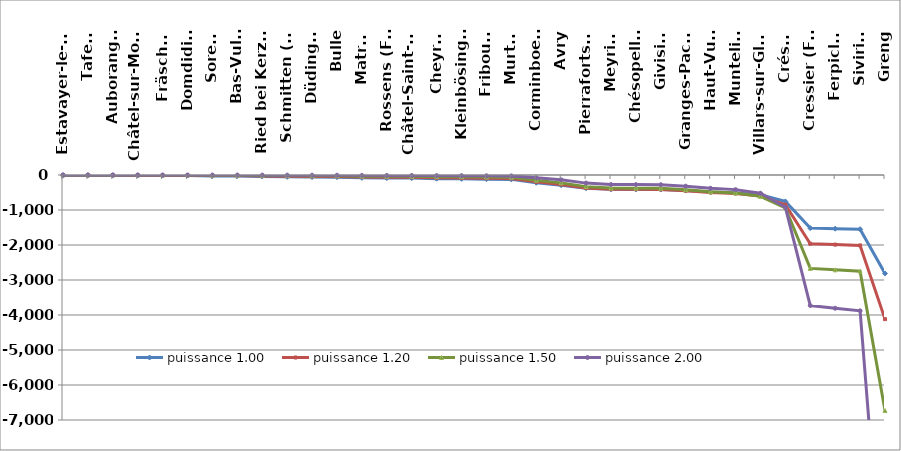
| Category | puissance 1.00 | puissance 1.20 | puissance 1.50 | puissance 2.00 |
|---|---|---|---|---|
| Estavayer-le-Lac | -4.992 | -2.059 | -0.503 | -0.04 |
| Tafers | -5.336 | -2.231 | -0.556 | -0.046 |
| Auboranges | -6.283 | -2.714 | -0.711 | -0.064 |
| Châtel-sur-Montsalvens | -9.467 | -4.438 | -1.314 | -0.145 |
| Fräschels | -13.942 | -7.063 | -2.349 | -0.315 |
| Domdidier | -15.922 | -8.283 | -2.867 | -0.41 |
| Sorens | -26.25 | -15.091 | -6.068 | -1.116 |
| Bas-Vully | -26.852 | -15.508 | -6.279 | -1.167 |
| Ried bei Kerzers | -41.483 | -26.135 | -12.056 | -2.786 |
| Schmitten (FR) | -52.844 | -34.944 | -17.333 | -4.521 |
| Düdingen | -59.557 | -40.336 | -20.739 | -5.743 |
| Bulle | -63.344 | -43.433 | -22.748 | -6.496 |
| Matran | -80.212 | -57.659 | -32.415 | -10.417 |
| Rossens (FR) | -87.786 | -64.252 | -37.113 | -12.477 |
| Châtel-Saint-Denis | -88.991 | -65.311 | -37.88 | -12.821 |
| Cheyres | -104.913 | -79.574 | -48.488 | -17.82 |
| Kleinbösingen | -109.302 | -83.585 | -51.562 | -19.342 |
| Fribourg | -119.544 | -93.07 | -58.977 | -23.137 |
| Murten | -125.31 | -98.482 | -63.295 | -25.422 |
| Corminboeuf | -221.702 | -195.299 | -148.952 | -79.577 |
| Avry | -291.587 | -271.329 | -224.669 | -137.652 |
| Pierrafortscha | -378.512 | -371.083 | -332.285 | -231.956 |
| Meyriez | -409.495 | -407.825 | -373.908 | -271.484 |
| Chésopelloz | -410.872 | -409.472 | -375.795 | -273.313 |
| Givisiez | -414.745 | -414.108 | -381.121 | -278.49 |
| Granges-Paccot | -444.265 | -449.724 | -422.527 | -319.545 |
| Haut-Vully | -484.63 | -499.192 | -481.4 | -380.248 |
| Muntelier | -508.039 | -528.265 | -516.698 | -417.87 |
| Villars-sur-Glâne | -567.166 | -602.875 | -609.475 | -520.794 |
| Crésuz | -755.217 | -850.083 | -936.48 | -923.399 |
| Cressier (FR) | -1517.749 | -1964.335 | -2668.031 | -3729.463 |
| Ferpicloz | -1533.499 | -1988.821 | -2709.668 | -3807.267 |
| Siviriez | -1548.216 | -2011.747 | -2748.769 | -3880.694 |
| Greng | -2812.591 | -4118.161 | -6730.553 | -12807.356 |